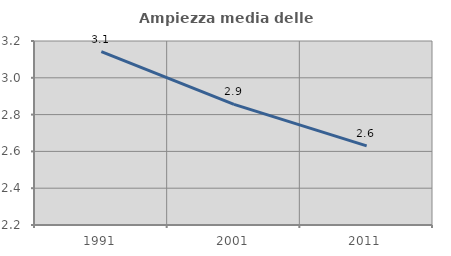
| Category | Ampiezza media delle famiglie |
|---|---|
| 1991.0 | 3.143 |
| 2001.0 | 2.856 |
| 2011.0 | 2.63 |